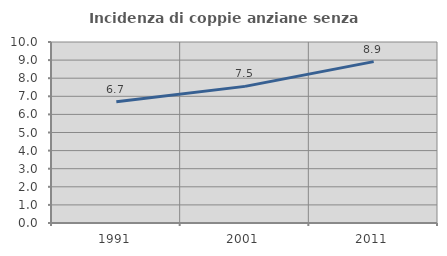
| Category | Incidenza di coppie anziane senza figli  |
|---|---|
| 1991.0 | 6.7 |
| 2001.0 | 7.548 |
| 2011.0 | 8.915 |